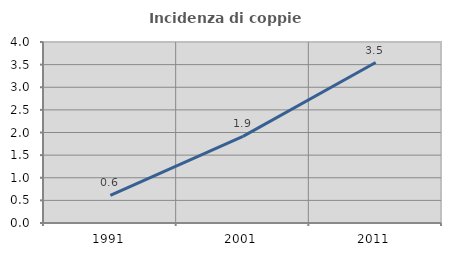
| Category | Incidenza di coppie miste |
|---|---|
| 1991.0 | 0.609 |
| 2001.0 | 1.915 |
| 2011.0 | 3.546 |